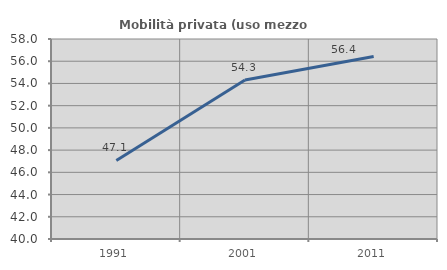
| Category | Mobilità privata (uso mezzo privato) |
|---|---|
| 1991.0 | 47.071 |
| 2001.0 | 54.318 |
| 2011.0 | 56.417 |